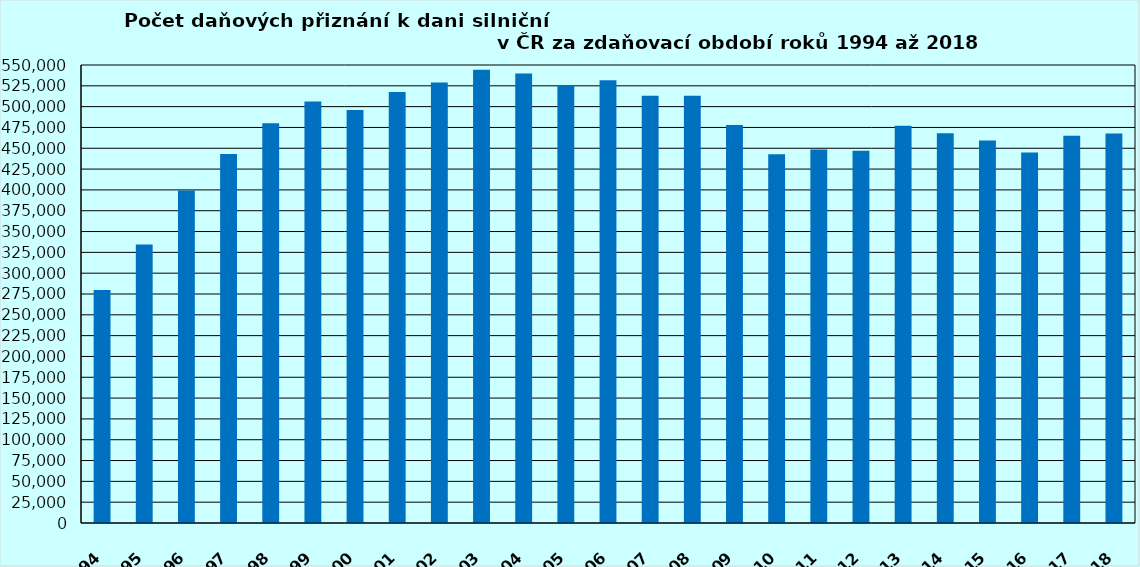
| Category | Series 1 |
|---|---|
| 1994.0 | 279797 |
| 1995.0 | 334460 |
| 1996.0 | 399157 |
| 1997.0 | 443229 |
| 1998.0 | 479914 |
| 1999.0 | 506279 |
| 2000.0 | 495820 |
| 2001.0 | 517428 |
| 2002.0 | 528848 |
| 2003.0 | 544269 |
| 2004.0 | 539786 |
| 2005.0 | 525648 |
| 2006.0 | 531697 |
| 2007.0 | 513087 |
| 2008.0 | 513064 |
| 2009.0 | 478026 |
| 2010.0 | 442865 |
| 2011.0 | 448384 |
| 2012.0 | 447122 |
| 2013.0 | 476949 |
| 2014.0 | 468004 |
| 2015.0 | 459271 |
| 2016.0 | 445023 |
| 2017.0 | 465042 |
| 2018.0 | 467782 |